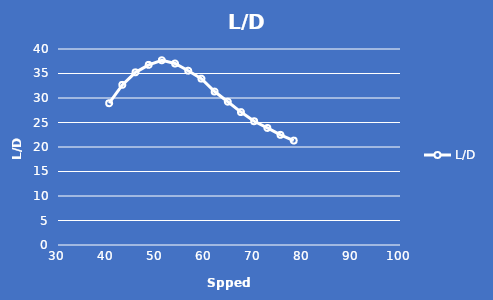
| Category | L/D |
|---|---|
| 40.470886862826355 | 28.935 |
| 43.16894598701478 | 32.68 |
| 45.867005111203206 | 35.24 |
| 48.56506423539163 | 36.765 |
| 51.26312335958006 | 37.698 |
| 53.961182483768475 | 37.037 |
| 56.6592416079569 | 35.569 |
| 59.357300732145326 | 33.951 |
| 62.05535985633375 | 31.318 |
| 64.75341898052217 | 29.24 |
| 67.4514781047106 | 27.127 |
| 70.14953722889902 | 25.253 |
| 72.84759635308744 | 23.885 |
| 75.54565547727587 | 22.479 |
| 78.24371460146429 | 21.311 |